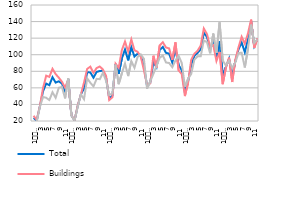
| Category | Total | Buildings  | Other construction |
|---|---|---|---|
| 1
2015 | 23.725 | 26.291 | 19.138 |
|  | 20.474 | 21.221 | 19.138 |
| 3 | 37.696 | 38.122 | 36.933 |
|  | 55.881 | 59.718 | 49.021 |
| 5 | 65.155 | 74.742 | 48.013 |
| 6
2015 | 63.228 | 73.239 | 45.327 |
| 7 | 72.862 | 83.005 | 54.729 |
| 8 | 66.359 | 76.62 | 48.013 |
| 9 | 67.925 | 72.3 | 60.101 |
| 10 | 65.155 | 67.418 | 61.108 |
| 11 | 55.64 | 60.282 | 47.342 |
| 12 | 70.454 | 69.859 | 71.517 |
| 1
2016 | 26.736 | 26.854 | 26.525 |
| 2
 | 20.594 | 20.657 | 20.481 |
| 3 | 38.057 | 38.685 | 36.933 |
| 4 | 52.027 | 52.019 | 52.043 |
| 5 | 59.253 | 66.479 | 46.335 |
| 6
2016 | 78.764 | 82.817 | 71.517 |
| 7 | 78.643 | 85.634 | 66.144 |
| 8 | 72.26 | 78.122 | 61.78 |
| 9 | 79.245 | 83.944 | 70.845 |
| 10 | 80.329 | 85.822 | 70.509 |
| 11 | 80.69 | 82.066 | 78.232 |
| 12 | 72.26 | 74.366 | 68.495 |
| 1
2017 | 47.451 | 45.258 | 51.371 |
| 2 | 50.341 | 48.638 | 53.386 |
| 3 | 88.76 | 89.202 | 87.969 |
| 4 | 77.077 | 84.131 | 64.466 |
| 5 | 95.504 | 105.54 | 77.56 |
| 6
2017 | 106.343 | 115.869 | 89.312 |
| 7 | 93.216 | 103.85 | 74.203 |
| 8 | 109.113 | 118.498 | 92.334 |
| 9 | 97.792 | 105.352 | 84.275 |
| 10 | 101.285 | 103.474 | 97.37 |
| 11 | 98.635 | 97.653 | 100.392 |
| 12 | 86.23 | 81.315 | 95.02 |
| 1
2018 | 61.782 | 63.286 | 59.093 |
| 2
 | 66.238 | 65.352 | 67.823 |
| 3 | 90.927 | 98.779 | 76.889 |
| 4 | 84.906 | 84.131 | 86.29 |
| 5 | 105.861 | 111.174 | 96.363 |
| 6
2018 | 109.354 | 115.117 | 99.049 |
| 7 | 102.248 | 108.732 | 90.655 |
| 8 | 101.285 | 107.606 | 89.983 |
| 9 | 90.566 | 93.709 | 84.947 |
| 10 | 107.065 | 114.93 | 93.005 |
| 11 | 87.435 | 81.127 | 98.713 |
| 12 | 81.413 | 76.62 | 89.983 |
| 1
2019 | 54.195 | 50.141 | 61.444 |
| 2
 | 67.684 | 65.915 | 70.845 |
| 3 | 87.796 | 93.897 | 76.889 |
| 4 | 98.635 | 101.221 | 94.012 |
| 5 | 102.248 | 104.601 | 98.041 |
| 6
2019 | 106.343 | 110.986 | 98.041 |
| 7 | 126.455 | 131.643 | 117.18 |
| 8 | 121.397 | 124.883 | 115.165 |
| 9 | 106.704 | 109.484 | 101.735 |
| 10 | 116.58 | 111.549 | 125.574 |
| 11 | 95.865 | 92.394 | 102.071 |
| 12 | 116.098 | 103.286 | 139.004 |
| 1
2020 | 74.669 | 64.413 | 93.005 |
| 2
 | 85.147 | 84.131 | 86.961 |
| 3 | 95.263 | 96.526 | 93.005 |
| 4 | 73.103 | 67.042 | 83.94 |
| 5 | 92.734 | 93.897 | 90.655 |
| 6
2020 | 106.5 | 108.9 | 102.1 |
| 7 | 114.773 | 121.69 | 102.406 |
| 8 | 102.971 | 113.239 | 84.611 |
| 9 | 118.988 | 125.634 | 107.107 |
| 10 | 140.185 | 142.347 | 136.318 |
| 11 | 110.317 | 108.169 | 114.158 |
| 12 | 119.109 | 119.437 | 118.523 |